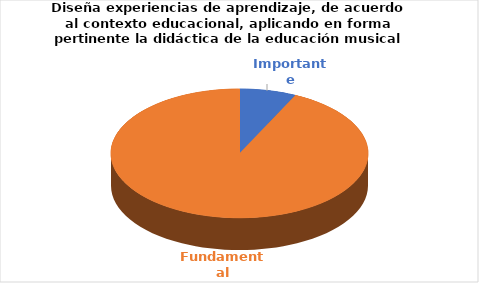
| Category | Series 0 |
|---|---|
| Importante | 1 |
| Fundamental | 13 |